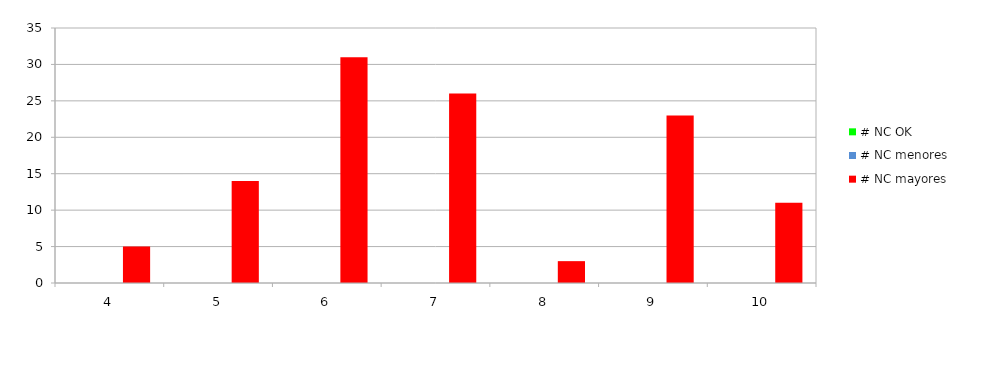
| Category | # NC OK | # NC menores | # NC mayores |
|---|---|---|---|
| 4.0 | 0 | 0 | 5 |
| 5.0 | 0 | 0 | 14 |
| 6.0 | 0 | 0 | 31 |
| 7.0 | 0 | 0 | 26 |
| 8.0 | 0 | 0 | 3 |
| 9.0 | 0 | 0 | 23 |
| 10.0 | 0 | 0 | 11 |